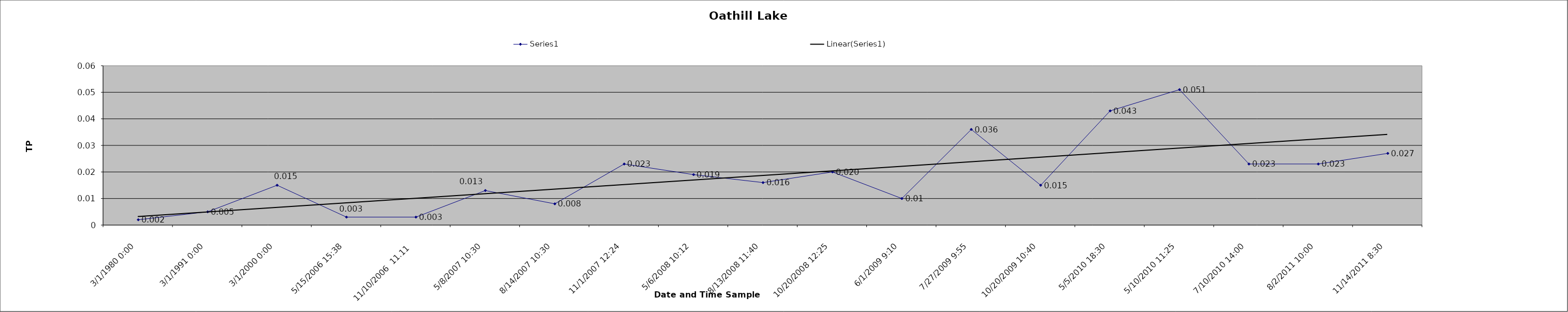
| Category | Series 0 |
|---|---|
| 01/03/1980 0:00 | 0.002 |
| 01/03/1991 0:00 | 0.005 |
| 01/03/2000 0:00 | 0.015 |
| 15/05/2006 15:38 | 0.003 |
| 11/10/2006  11.11  | 0.003 |
| 08/05/2007 10:30 | 0.013 |
| 14/08/2007 10:30 | 0.008 |
| 01/11/2007 12:24 | 0.023 |
| 06/05/2008 10:12 | 0.019 |
| 13/08/2008 11:40 | 0.016 |
| 20/10/2008 12:25 | 0.02 |
| 01/06/2009 9:10 | 0.01 |
| 27/07/2009 9:55 | 0.036 |
| 20/10/2009 10:40 | 0.015 |
| 05/05/2010 18:30 | 0.043 |
| 10/05/2010 11:25 | 0.051 |
| 10/07/2010 14:00 | 0.023 |
| 02/08/2011 10:00 | 0.023 |
| 14/11/2011 8:30 | 0.027 |